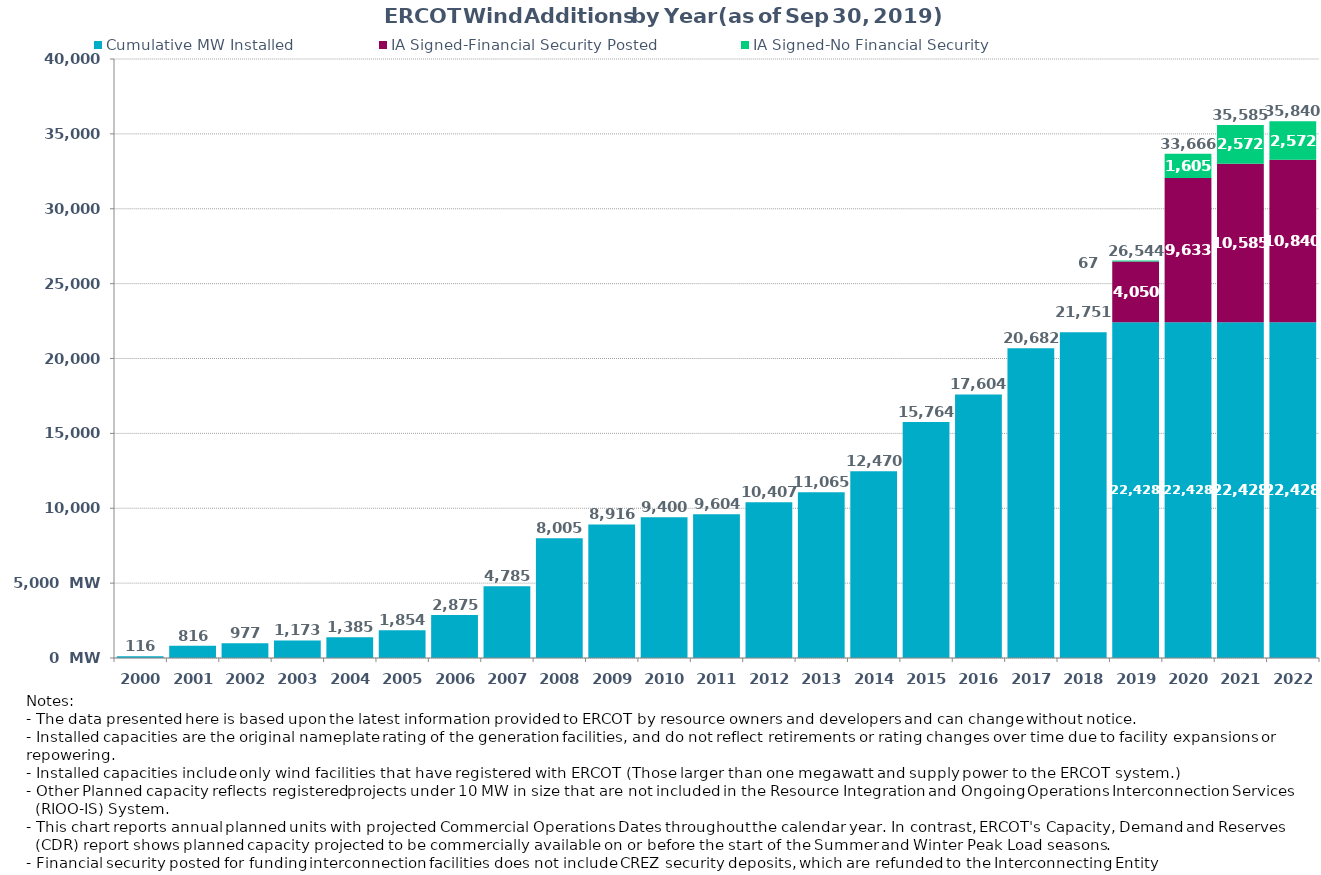
| Category | Cumulative MW Installed | IA Signed-Financial Security Posted  | IA Signed-No Financial Security  | Other Planned | Cumulative Installed and Planned |
|---|---|---|---|---|---|
| 2000.0 | 116 | 0 | 0 | 0 | 116 |
| 2001.0 | 816 | 0 | 0 | 0 | 816 |
| 2002.0 | 977 | 0 | 0 | 0 | 977 |
| 2003.0 | 1173 | 0 | 0 | 0 | 1173 |
| 2004.0 | 1385 | 0 | 0 | 0 | 1385 |
| 2005.0 | 1854 | 0 | 0 | 0 | 1854 |
| 2006.0 | 2875 | 0 | 0 | 0 | 2875 |
| 2007.0 | 4785 | 0 | 0 | 0 | 4785 |
| 2008.0 | 8005 | 0 | 0 | 0 | 8005 |
| 2009.0 | 8916 | 0 | 0 | 0 | 8916 |
| 2010.0 | 9400 | 0 | 0 | 0 | 9400 |
| 2011.0 | 9604 | 0 | 0 | 0 | 9604 |
| 2012.0 | 10407 | 0 | 0 | 0 | 10407 |
| 2013.0 | 11065 | 0 | 0 | 0 | 11065 |
| 2014.0 | 12470 | 0 | 0 | 0 | 12470 |
| 2015.0 | 15764 | 0 | 0 | 0 | 15764 |
| 2016.0 | 17604 | 0 | 0 | 0 | 17604 |
| 2017.0 | 20682 | 0 | 0 | 0 | 20682 |
| 2018.0 | 21751 | 0 | 0 | 0 | 21751 |
| 2019.0 | 22427.74 | 4049.54 | 66.7 | 0 | 26543.98 |
| 2020.0 | 22427.74 | 9633.44 | 1605.02 | 0 | 33666.2 |
| 2021.0 | 22427.74 | 10584.79 | 2572.02 | 0 | 35584.55 |
| 2022.0 | 22427.74 | 10840.09 | 2572.02 | 0 | 35839.85 |